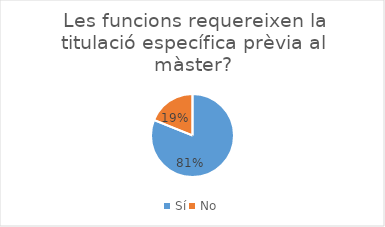
| Category | Series 0 |
|---|---|
| Sí | 30 |
| No | 7 |